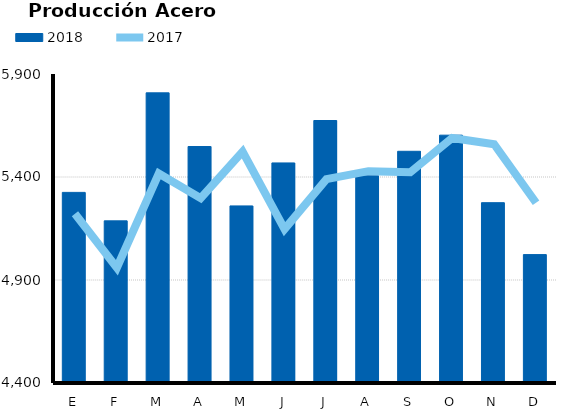
| Category | 2018 |
|---|---|
| E | 5325.299 |
| F | 5187.108 |
| M | 5808.571 |
| A | 5547.976 |
| M | 5259.66 |
| J | 5468.328 |
| J | 5674.215 |
| A | 5405.825 |
| S | 5524.823 |
| O | 5603.078 |
| N | 5275.336 |
| D | 5023.271 |